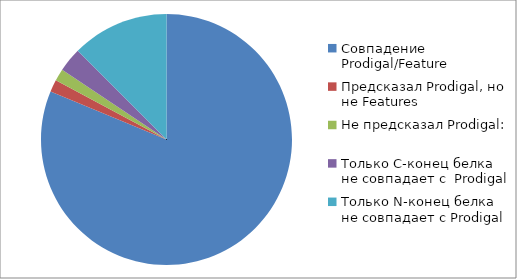
| Category | Series 0 |
|---|---|
| Совпадение Prodigal/Feature | 52 |
| Предсказал Prodigal, но не Features | 1 |
| Не предсказал Prodigal: | 1 |
| Только С-конец белка не совпадает с  Prodigal | 2 |
| Только N-конец белка не совпадает с Prodigal | 8 |